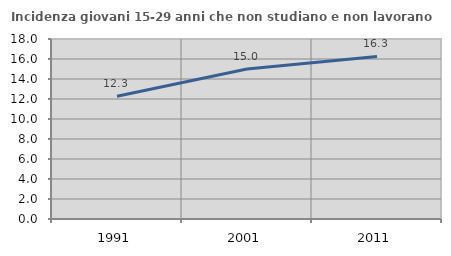
| Category | Incidenza giovani 15-29 anni che non studiano e non lavorano  |
|---|---|
| 1991.0 | 12.278 |
| 2001.0 | 14.991 |
| 2011.0 | 16.251 |